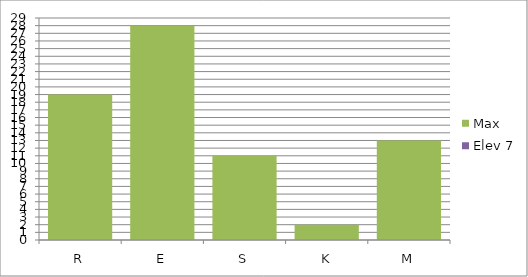
| Category | Max | Elev 7 |
|---|---|---|
| R | 19 | 0 |
| E | 28 | 0 |
| S | 11 | 0 |
| K | 2 | 0 |
| M | 13 | 0 |